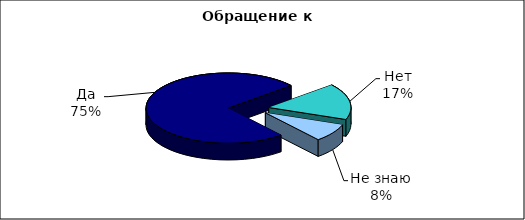
| Category | Series 0 |
|---|---|
| Да | 900 |
| Нет | 200 |
| Не знаю | 100 |